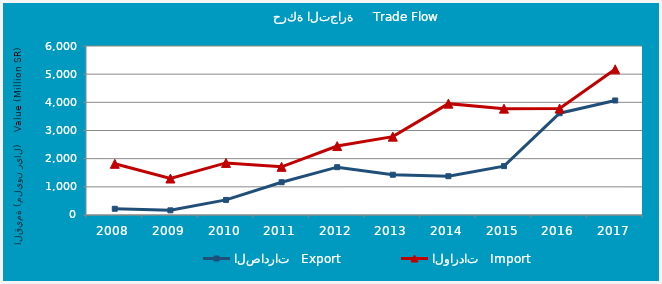
| Category | الصادرات   Export | الواردات   Import |
|---|---|---|
| 2008.0 | 221693527 | 1817403905 |
| 2009.0 | 165633707 | 1295323623 |
| 2010.0 | 535817139 | 1848853493 |
| 2011.0 | 1162964492 | 1709997311 |
| 2012.0 | 1697923030 | 2447700022 |
| 2013.0 | 1429091980 | 2781384810 |
| 2014.0 | 1376814487 | 3953843861 |
| 2015.0 | 1735576385 | 3776132172 |
| 2016.0 | 3613425176 | 3778638327 |
| 2017.0 | 4065916779 | 5173102226 |